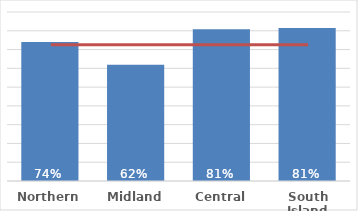
| Category | Dep 5 |
|---|---|
| Northern | 0.74 |
| Midland | 0.619 |
| Central | 0.809 |
| South Island | 0.815 |